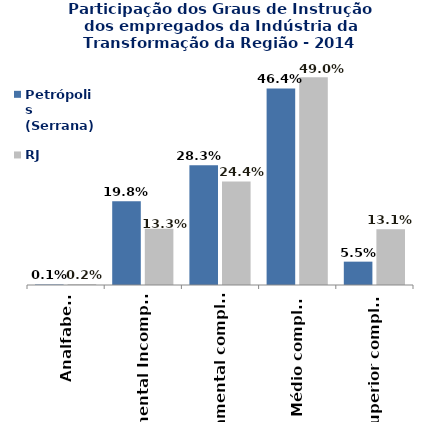
| Category | Petrópolis (Serrana) | RJ |
|---|---|---|
| Analfabeto | 0.001 | 0.002 |
| Fundamental Incompleto | 0.198 | 0.133 |
| Fundamental completo | 0.283 | 0.244 |
| Médio completo | 0.464 | 0.49 |
| Superior completo | 0.055 | 0.131 |